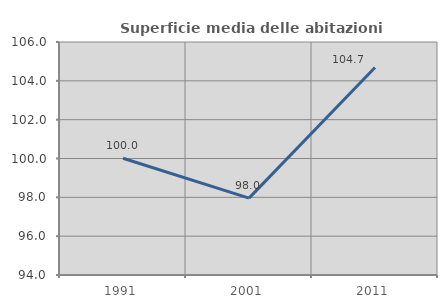
| Category | Superficie media delle abitazioni occupate |
|---|---|
| 1991.0 | 100.015 |
| 2001.0 | 97.96 |
| 2011.0 | 104.684 |